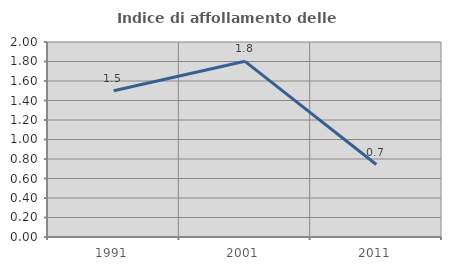
| Category | Indice di affollamento delle abitazioni  |
|---|---|
| 1991.0 | 1.5 |
| 2001.0 | 1.802 |
| 2011.0 | 0.743 |